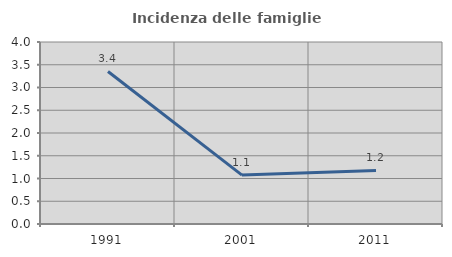
| Category | Incidenza delle famiglie numerose |
|---|---|
| 1991.0 | 3.352 |
| 2001.0 | 1.075 |
| 2011.0 | 1.176 |